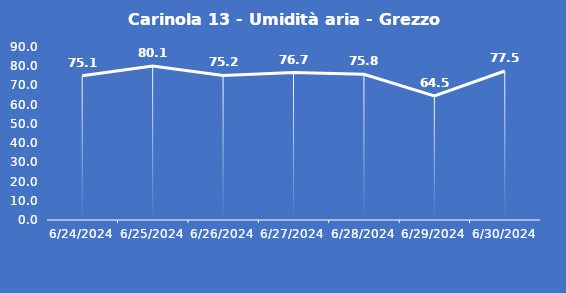
| Category | Carinola 13 - Umidità aria - Grezzo (%) |
|---|---|
| 6/24/24 | 75.1 |
| 6/25/24 | 80.1 |
| 6/26/24 | 75.2 |
| 6/27/24 | 76.7 |
| 6/28/24 | 75.8 |
| 6/29/24 | 64.5 |
| 6/30/24 | 77.5 |